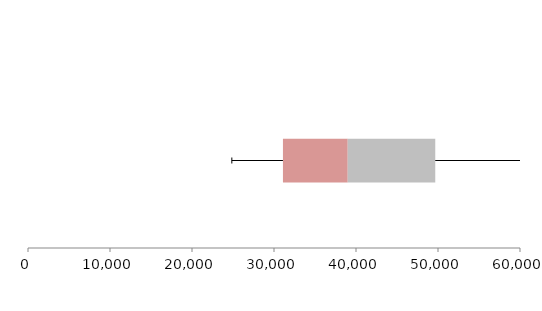
| Category | Series 1 | Series 2 | Series 3 |
|---|---|---|---|
| 0 | 31091.276 | 7900.554 | 10674.564 |